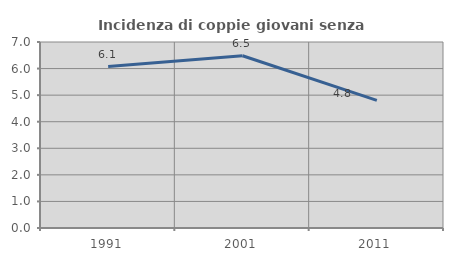
| Category | Incidenza di coppie giovani senza figli |
|---|---|
| 1991.0 | 6.077 |
| 2001.0 | 6.481 |
| 2011.0 | 4.805 |